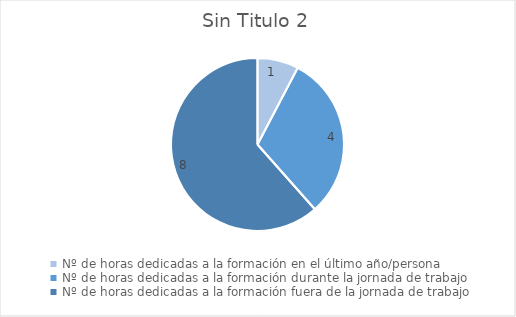
| Category | Series 0 |
|---|---|
| Nº de horas dedicadas a la formación en el último año/persona | 1 |
| Nº de horas dedicadas a la formación durante la jornada de trabajo | 4 |
| Nº de horas dedicadas a la formación fuera de la jornada de trabajo | 8 |